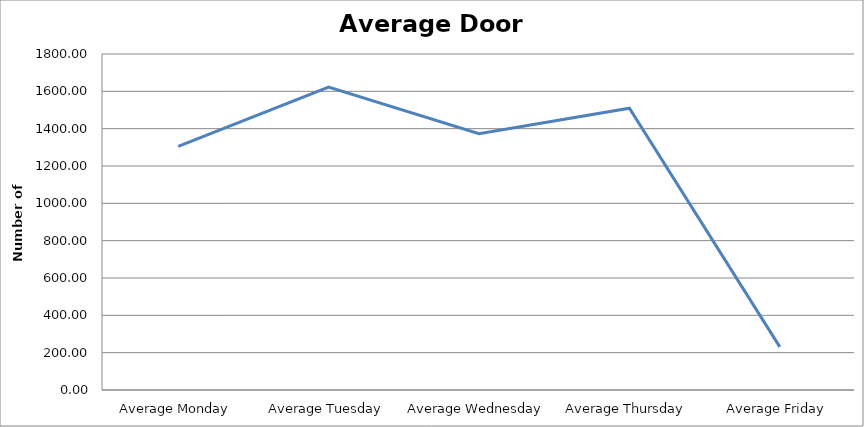
| Category | Series 0 |
|---|---|
| Average Monday | 1305.25 |
| Average Tuesday | 1623 |
| Average Wednesday | 1372.75 |
| Average Thursday | 1509.5 |
| Average Friday | 231 |